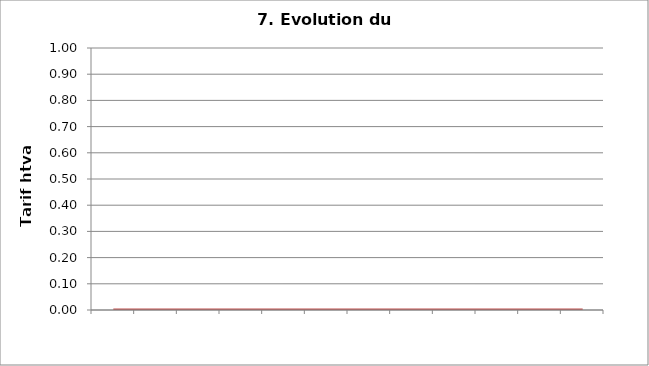
| Category | Tarif htva |
|---|---|
| 0 | 0 |
| 1900-01-01 | 0 |
| 1900-01-02 | 0 |
| 1900-01-03 | 0 |
| 1900-01-04 | 0 |
| 1900-01-05 | 0 |
| 1900-01-06 | 0 |
| 1900-01-07 | 0 |
| 1900-01-08 | 0 |
| 1900-01-09 | 0 |
| 1900-01-10 | 0 |
| 1900-01-11 | 0 |